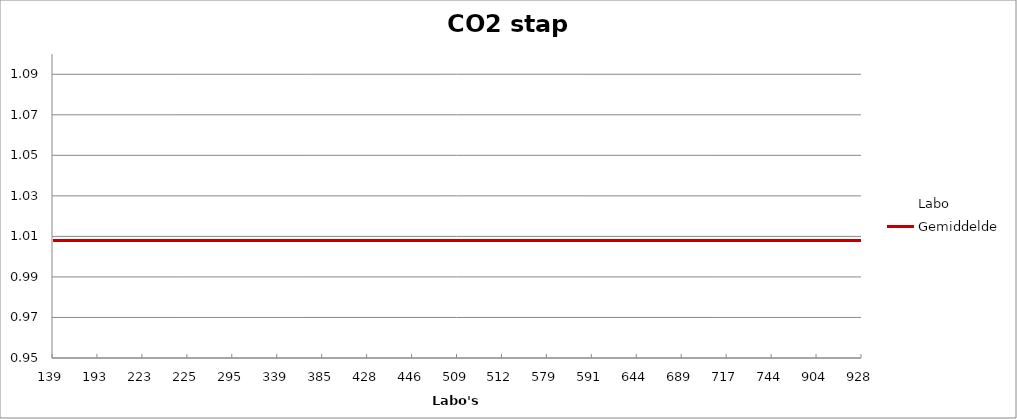
| Category | Labo | Gemiddelde |
|---|---|---|
| 139.0 | 0.989 | 1.008 |
| 193.0 | 0.967 | 1.008 |
| 223.0 | 1.008 | 1.008 |
| 225.0 | 1.033 | 1.008 |
| 295.0 | 1.016 | 1.008 |
| 339.0 | 1 | 1.008 |
| 385.0 | 0.986 | 1.008 |
| 428.0 | 1.005 | 1.008 |
| 446.0 | 0.994 | 1.008 |
| 509.0 | 1.019 | 1.008 |
| 512.0 | 1.003 | 1.008 |
| 579.0 | 1 | 1.008 |
| 591.0 | 1.071 | 1.008 |
| 644.0 | 1.085 | 1.008 |
| 689.0 | 1.003 | 1.008 |
| 717.0 | 0.983 | 1.008 |
| 744.0 | 1.003 | 1.008 |
| 904.0 | 1.052 | 1.008 |
| 928.0 | 1.011 | 1.008 |